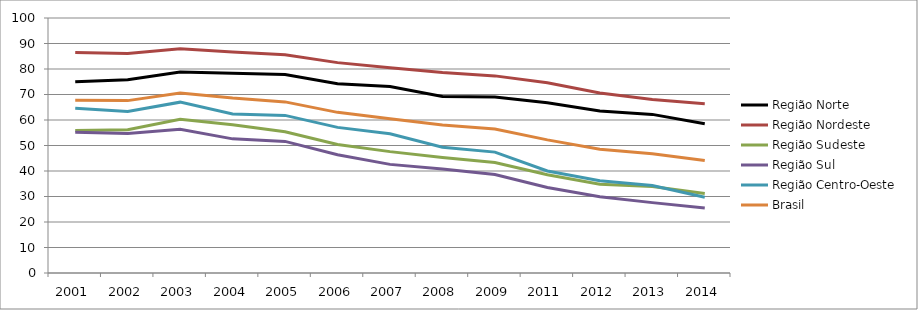
| Category | Região Norte | Região Nordeste | Região Sudeste | Região Sul | Região Centro-Oeste | Brasil |
|---|---|---|---|---|---|---|
| 2001.0 | 75 | 86.5 | 55.9 | 55.2 | 64.6 | 67.7 |
| 2002.0 | 75.8 | 86.1 | 56.2 | 54.7 | 63.3 | 67.6 |
| 2003.0 | 78.8 | 87.9 | 60.3 | 56.4 | 67 | 70.6 |
| 2004.0 | 78.3 | 86.7 | 58.1 | 52.6 | 62.4 | 68.6 |
| 2005.0 | 77.8 | 85.6 | 55.4 | 51.6 | 61.8 | 67.1 |
| 2006.0 | 74.2 | 82.5 | 50.4 | 46.4 | 57.1 | 63 |
| 2007.0 | 73.1 | 80.5 | 47.6 | 42.6 | 54.6 | 60.5 |
| 2008.0 | 69.2 | 78.6 | 45.3 | 40.8 | 49.3 | 58 |
| 2009.0 | 69 | 77.3 | 43.3 | 38.6 | 47.4 | 56.5 |
| 2011.0 | 66.8 | 74.6 | 38.5 | 33.5 | 40 | 52.2 |
| 2012.0 | 63.5 | 70.6 | 34.8 | 29.9 | 36.2 | 48.5 |
| 2013.0 | 62.2 | 68 | 33.9 | 27.6 | 34.3 | 46.8 |
| 2014.0 | 58.5 | 66.4 | 31.2 | 25.5 | 29.7 | 44.1 |